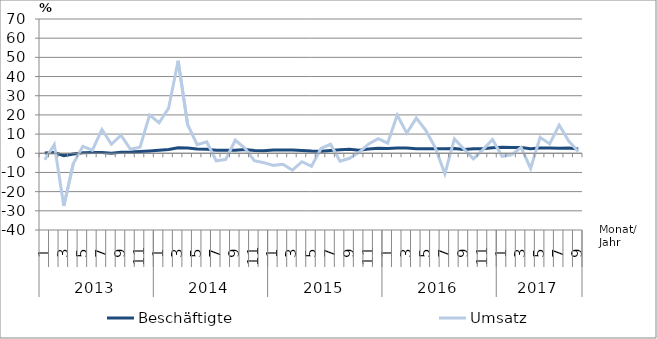
| Category | Beschäftigte | Umsatz |
|---|---|---|
| 0 | 0.1 | -3.4 |
| 1 | 0.4 | 4.5 |
| 2 | -1.3 | -27.5 |
| 3 | -0.4 | -5.3 |
| 4 | 0.3 | 3.6 |
| 5 | 0.4 | 1.6 |
| 6 | 0.4 | 12.4 |
| 7 | 0 | 4.7 |
| 8 | 0.5 | 9.4 |
| 9 | 0.6 | 2.1 |
| 10 | 0.9 | 3.2 |
| 11 | 1.2 | 19.9 |
| 12 | 1.6 | 15.9 |
| 13 | 2 | 23.5 |
| 14 | 2.9 | 48.2 |
| 15 | 2.8 | 14.9 |
| 16 | 2.2 | 4.5 |
| 17 | 2.1 | 6 |
| 18 | 1.6 | -3.9 |
| 19 | 1.6 | -3.2 |
| 20 | 1.6 | 6.8 |
| 21 | 2 | 2.7 |
| 22 | 1.4 | -3.9 |
| 23 | 1.3 | -4.9 |
| 24 | 1.7 | -6.3 |
| 25 | 1.7 | -5.7 |
| 26 | 1.7 | -8.8 |
| 27 | 1.5 | -4.4 |
| 28 | 1.2 | -6.8 |
| 29 | 1.1 | 2.5 |
| 30 | 1.5 | 4.7 |
| 31 | 1.8 | -4.1 |
| 32 | 2.1 | -2.6 |
| 33 | 1.6 | 0.5 |
| 34 | 2.2 | 4.9 |
| 35 | 2.6 | 7.6 |
| 36 | 2.5 | 5.3 |
| 37 | 2.7 | 19.9 |
| 38 | 2.8 | 10.5 |
| 39 | 2.4 | 18.3 |
| 40 | 2.4 | 11.9 |
| 41 | 2.4 | 2.8 |
| 42 | 2.3 | -10.7 |
| 43 | 2.5 | 7.5 |
| 44 | 2 | 2.2 |
| 45 | 2.4 | -2.9 |
| 46 | 2.3 | 1.9 |
| 47 | 2.9 | 7.2 |
| 48 | 3.1 | -1.6 |
| 49 | 3 | -0.8 |
| 50 | 3 | 3.1 |
| 51 | 2.4 | -7.9 |
| 52 | 2.8 | 8.3 |
| 53 | 2.8 | 4.9 |
| 54 | 2.6 | 14.7 |
| 55 | 2.7 | 6.4 |
| 56 | 2.2 | 0.9 |